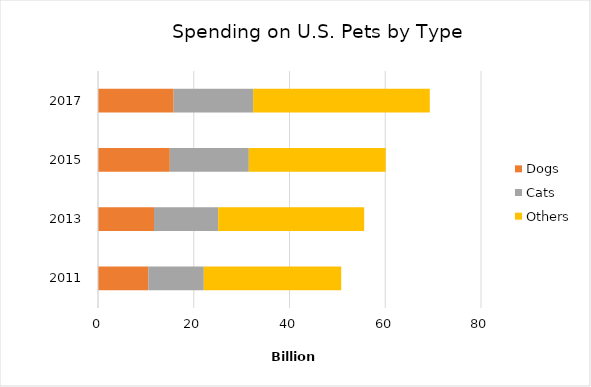
| Category | Dogs | Cats | Others |
|---|---|---|---|
| 2011.0 | 10500000000 | 11600000000 | 28700000000 |
| 2013.0 | 11700000000 | 13400000000 | 30500000000 |
| 2015.0 | 15000000000 | 16500000000 | 28600000000 |
| 2017.0 | 15800000000 | 16600000000 | 36900000000 |